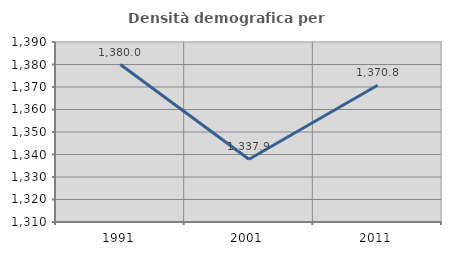
| Category | Densità demografica |
|---|---|
| 1991.0 | 1379.987 |
| 2001.0 | 1337.913 |
| 2011.0 | 1370.761 |